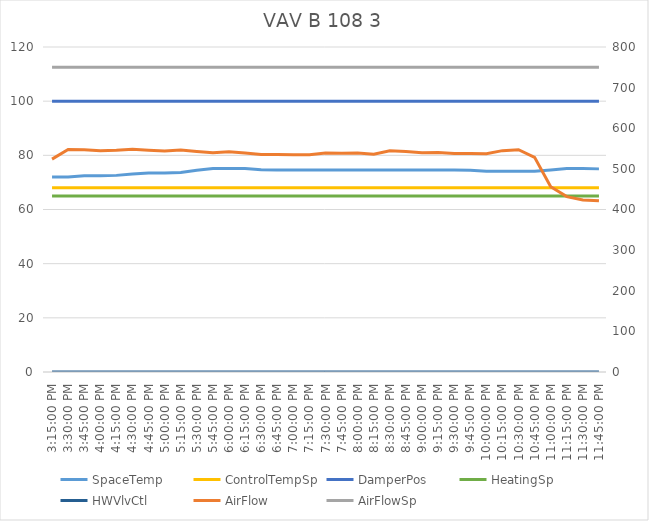
| Category | SpaceTemp | ControlTempSp | DamperPos | HeatingSp | HWVlvCtl |
|---|---|---|---|---|---|
| 2019-09-07 15:15:00 | 72 | 68 | 100 | 65 | 0 |
| 2019-09-07 15:30:00 | 72 | 68 | 100 | 65 | 0 |
| 2019-09-07 15:45:00 | 72.5 | 68 | 100 | 65 | 0 |
| 2019-09-07 16:00:00 | 72.5 | 68 | 100 | 65 | 0 |
| 2019-09-07 16:15:00 | 72.6 | 68 | 100 | 65 | 0 |
| 2019-09-07 16:30:00 | 73.1 | 68 | 100 | 65 | 0 |
| 2019-09-07 16:45:00 | 73.5 | 68 | 100 | 65 | 0 |
| 2019-09-07 17:00:00 | 73.5 | 68 | 100 | 65 | 0 |
| 2019-09-07 17:15:00 | 73.7 | 68 | 100 | 65 | 0 |
| 2019-09-07 17:30:00 | 74.5 | 68 | 100 | 65 | 0 |
| 2019-09-07 17:45:00 | 75.1 | 68 | 100 | 65 | 0 |
| 2019-09-07 18:00:00 | 75.1 | 68 | 100 | 65 | 0 |
| 2019-09-07 18:15:00 | 75.1 | 68 | 100 | 65 | 0 |
| 2019-09-07 18:30:00 | 74.7 | 68 | 100 | 65 | 0 |
| 2019-09-07 18:45:00 | 74.6 | 68 | 100 | 65 | 0 |
| 2019-09-07 19:00:00 | 74.6 | 68 | 100 | 65 | 0 |
| 2019-09-07 19:15:00 | 74.6 | 68 | 100 | 65 | 0 |
| 2019-09-07 19:30:00 | 74.6 | 68 | 100 | 65 | 0 |
| 2019-09-07 19:45:00 | 74.6 | 68 | 100 | 65 | 0 |
| 2019-09-07 20:00:00 | 74.6 | 68 | 100 | 65 | 0 |
| 2019-09-07 20:15:00 | 74.6 | 68 | 100 | 65 | 0 |
| 2019-09-07 20:30:00 | 74.6 | 68 | 100 | 65 | 0 |
| 2019-09-07 20:45:00 | 74.6 | 68 | 100 | 65 | 0 |
| 2019-09-07 21:00:00 | 74.6 | 68 | 100 | 65 | 0 |
| 2019-09-07 21:15:00 | 74.6 | 68 | 100 | 65 | 0 |
| 2019-09-07 21:30:00 | 74.6 | 68 | 100 | 65 | 0 |
| 2019-09-07 21:45:00 | 74.5 | 68 | 100 | 65 | 0 |
| 2019-09-07 22:00:00 | 74.1 | 68 | 100 | 65 | 0 |
| 2019-09-07 22:15:00 | 74.1 | 68 | 100 | 65 | 0 |
| 2019-09-07 22:30:00 | 74.1 | 68 | 100 | 65 | 0 |
| 2019-09-07 22:45:00 | 74.1 | 68 | 100 | 65 | 0 |
| 2019-09-07 23:00:00 | 74.6 | 68 | 100 | 65 | 0 |
| 2019-09-07 23:15:00 | 75.1 | 68 | 100 | 65 | 0 |
| 2019-09-07 23:30:00 | 75.1 | 68 | 100 | 65 | 0 |
| 2019-09-07 23:45:00 | 75 | 68 | 100 | 65 | 0 |